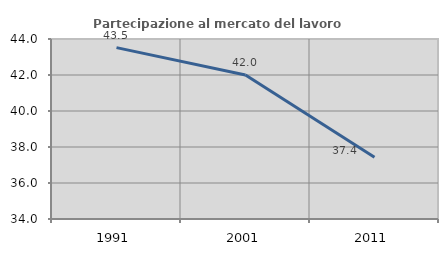
| Category | Partecipazione al mercato del lavoro  femminile |
|---|---|
| 1991.0 | 43.522 |
| 2001.0 | 41.998 |
| 2011.0 | 37.431 |